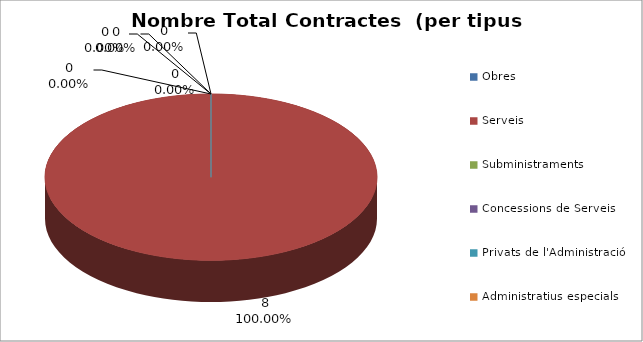
| Category | Nombre Total Contractes |
|---|---|
| Obres | 0 |
| Serveis | 8 |
| Subministraments | 0 |
| Concessions de Serveis | 0 |
| Privats de l'Administració | 0 |
| Administratius especials | 0 |